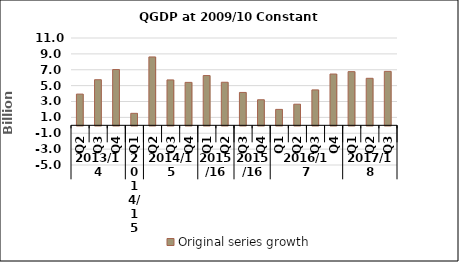
| Category | Original series growth |
|---|---|
| 0 | 3.932 |
| 1 | 5.743 |
| 2 | 7.027 |
| 3 | 1.509 |
| 4 | 8.612 |
| 5 | 5.718 |
| 6 | 5.409 |
| 7 | 6.269 |
| 8 | 5.424 |
| 9 | 4.14 |
| 10 | 3.22 |
| 11 | 2.005 |
| 12 | 2.659 |
| 13 | 4.462 |
| 14 | 6.46 |
| 15 | 6.762 |
| 16 | 5.921 |
| 17 | 6.796 |